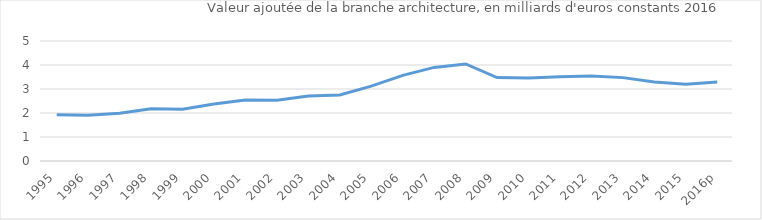
| Category | Architecture |
|---|---|
| 1995 | 1.926 |
| 1996 | 1.911 |
| 1997 | 1.993 |
| 1998 | 2.177 |
| 1999 | 2.153 |
| 2000 | 2.373 |
| 2001 | 2.542 |
| 2002 | 2.536 |
| 2003 | 2.704 |
| 2004 | 2.754 |
| 2005 | 3.117 |
| 2006 | 3.569 |
| 2007 | 3.899 |
| 2008 | 4.043 |
| 2009 | 3.476 |
| 2010 | 3.463 |
| 2011 | 3.513 |
| 2012 | 3.542 |
| 2013 | 3.474 |
| 2014 | 3.294 |
| 2015 | 3.193 |
| 2016p | 3.293 |